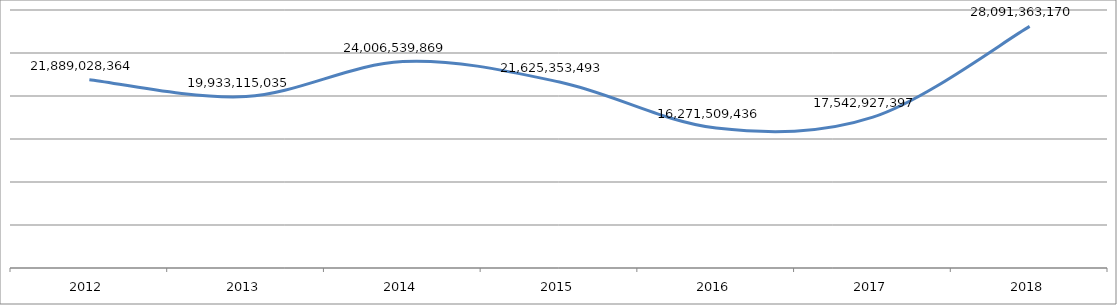
| Category | Series 0 |
|---|---|
| 2012.0 | 21889028364 |
| 2013.0 | 19933115035 |
| 2014.0 | 24006539869 |
| 2015.0 | 21625353493 |
| 2016.0 | 16271509436 |
| 2017.0 | 17542927397 |
| 2018.0 | 28091363170 |